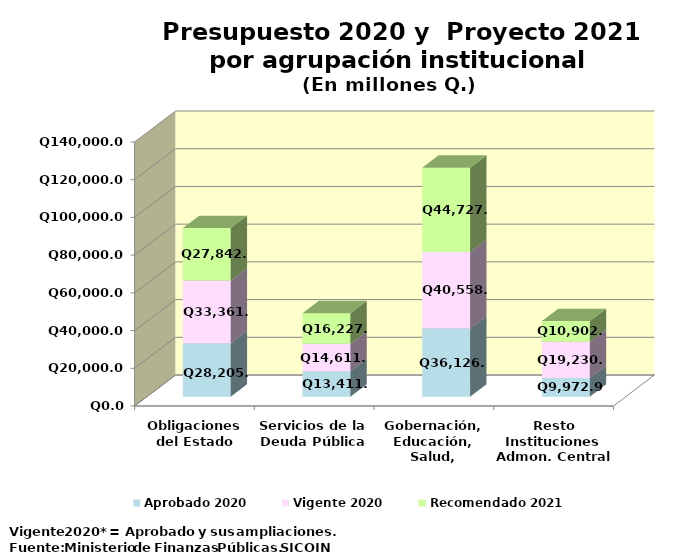
| Category | Aprobado 2020 | Vigente 2020 | Recomendado 2021 |
|---|---|---|---|
| Obligaciones del Estado | 28205.1 | 33361.1 | 27842.8 |
| Servicios de la Deuda Pública | 13411 | 14611 | 16227.3 |
| Gobernación, Educación, Salud, Comunicaciones | 36126 | 40558.6 | 44727.5 |
| Resto Instituciones Admon. Central | 9972.9 | 19230 | 10902.5 |